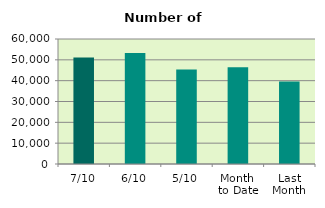
| Category | Series 0 |
|---|---|
| 7/10 | 51132 |
| 6/10 | 53290 |
| 5/10 | 45326 |
| Month 
to Date | 46451.6 |
| Last
Month | 39557.091 |